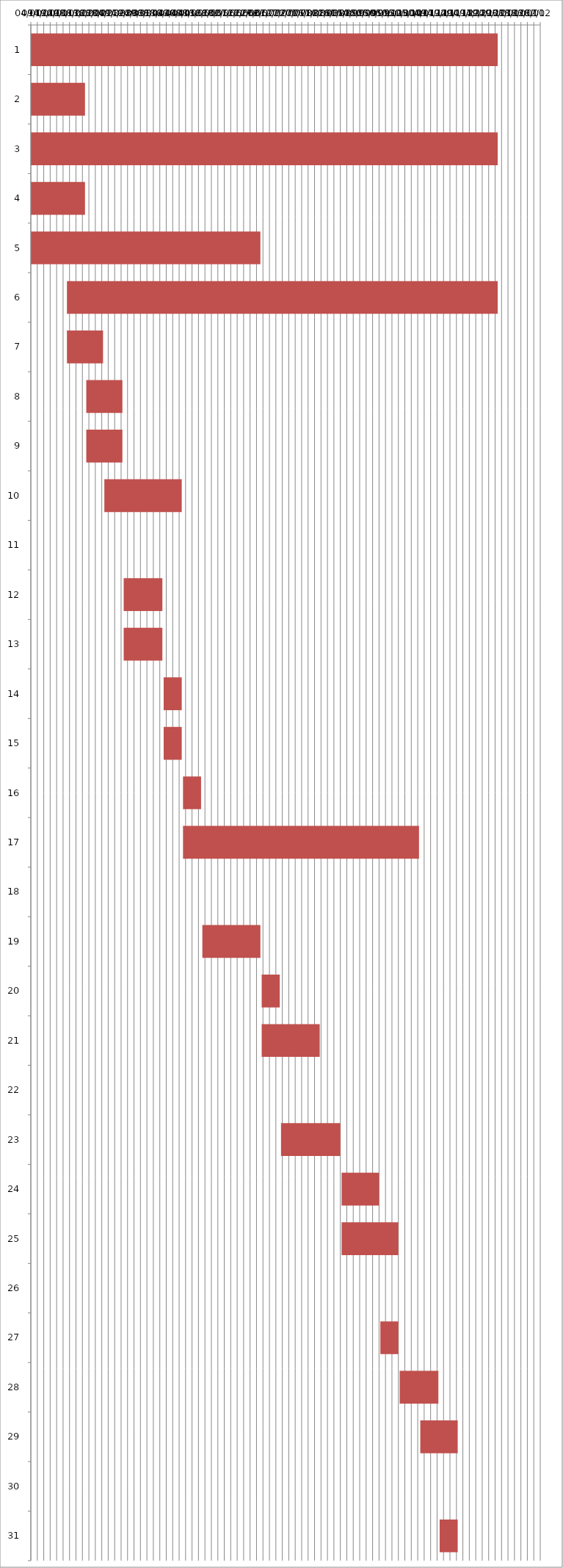
| Category | Fecha de inicio | DURACIÓN |
|---|---|---|
| 0 | 04/01/2016 | 362 |
| 1 | 04/01/2016 | 42 |
| 2 | 04/01/2016 | 362 |
| 3 | 04/01/2016 | 42 |
| 4 | 04/01/2016 | 178 |
| 5 | 01/02/2016 | 334 |
| 6 | 01/02/2016 | 28 |
| 7 | 16/02/2016 | 28 |
| 8 | 16/02/2016 | 28 |
| 9 | 01/03/2016 | 60 |
| 10 | 10/03/2016 | 0 |
| 11 | 16/03/2016 | 30 |
| 12 | 16/03/2016 | 30 |
| 13 | 16/04/2016 | 14 |
| 14 | 16/04/2016 | 14 |
| 15 | 01/05/2016 | 14 |
| 16 | 01/05/2016 | 183 |
| 17 | 10/05/2016 | 0 |
| 18 | 16/05/2016 | 45 |
| 19 | 01/07/2016 | 14 |
| 20 | 01/07/2016 | 45 |
| 21 | 10/07/2016 | 0 |
| 22 | 16/07/2016 | 46 |
| 23 | 01/09/2016 | 29 |
| 24 | 01/09/2016 | 44 |
| 25 | 10/09/2016 | 0 |
| 26 | 01/10/2016 | 14 |
| 27 | 16/10/2016 | 30 |
| 28 | 01/11/2016 | 29 |
| 29 | 10/11/2016 | 0 |
| 30 | 16/11/2016 | 14 |